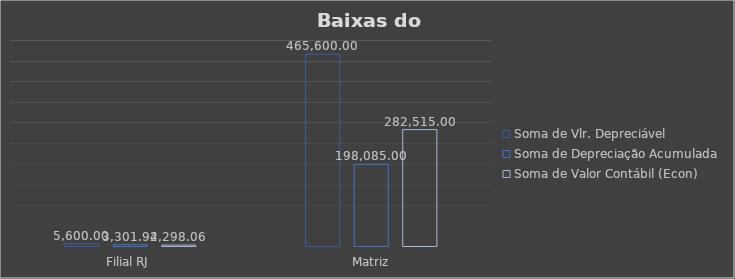
| Category | Soma de Vlr. Depreciável | Soma de Depreciação Acumulada | Soma de Valor Contábil (Econ) |
|---|---|---|---|
| Filial RJ | 5600 | 3301.944 | 2298.056 |
| Matriz | 465600 | 198085 | 282515 |